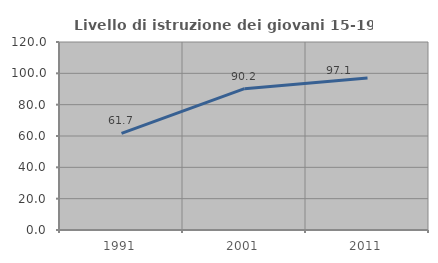
| Category | Livello di istruzione dei giovani 15-19 anni |
|---|---|
| 1991.0 | 61.677 |
| 2001.0 | 90.217 |
| 2011.0 | 97.059 |